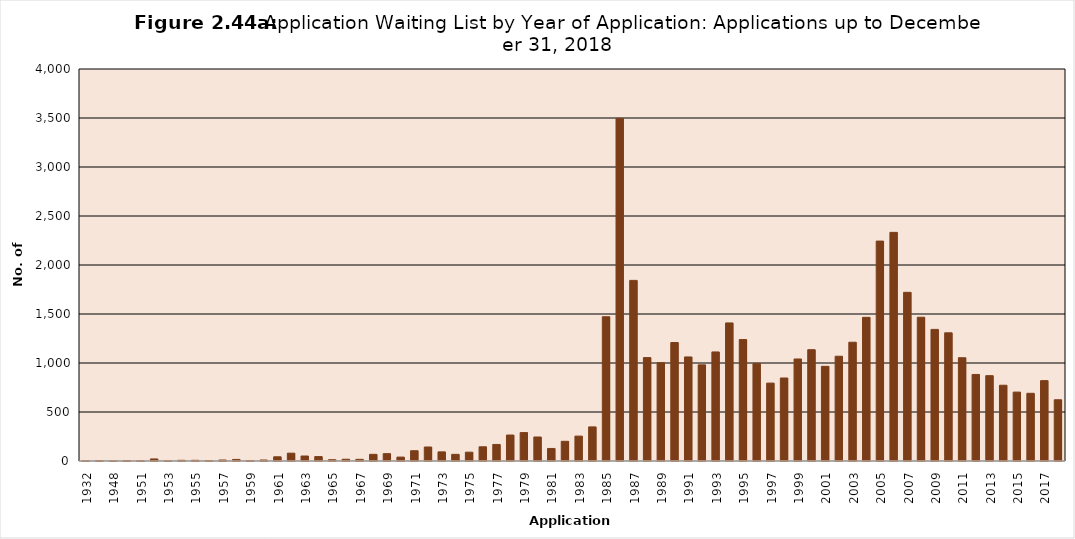
| Category | Series 0 |
|---|---|
| 1932.0 | 1 |
| 1947.0 | 4 |
| 1948.0 | 1 |
| 1950.0 | 4 |
| 1951.0 | 3 |
| 1952.0 | 21 |
| 1953.0 | 2 |
| 1954.0 | 7 |
| 1955.0 | 7 |
| 1956.0 | 5 |
| 1957.0 | 10 |
| 1958.0 | 16 |
| 1959.0 | 5 |
| 1960.0 | 10 |
| 1961.0 | 43 |
| 1962.0 | 80 |
| 1963.0 | 51 |
| 1964.0 | 45 |
| 1965.0 | 13 |
| 1966.0 | 18 |
| 1967.0 | 17 |
| 1968.0 | 68 |
| 1969.0 | 75 |
| 1970.0 | 40 |
| 1971.0 | 105 |
| 1972.0 | 143 |
| 1973.0 | 93 |
| 1974.0 | 68 |
| 1975.0 | 90 |
| 1976.0 | 145 |
| 1977.0 | 169 |
| 1978.0 | 265 |
| 1979.0 | 290 |
| 1980.0 | 245 |
| 1981.0 | 128 |
| 1982.0 | 201 |
| 1983.0 | 254 |
| 1984.0 | 348 |
| 1985.0 | 1472 |
| 1986.0 | 3496 |
| 1987.0 | 1843 |
| 1988.0 | 1055 |
| 1989.0 | 1004 |
| 1990.0 | 1209 |
| 1991.0 | 1062 |
| 1992.0 | 981 |
| 1993.0 | 1113 |
| 1994.0 | 1409 |
| 1995.0 | 1239 |
| 1996.0 | 996 |
| 1997.0 | 795 |
| 1998.0 | 847 |
| 1999.0 | 1041 |
| 2000.0 | 1136 |
| 2001.0 | 966 |
| 2002.0 | 1069 |
| 2003.0 | 1212 |
| 2004.0 | 1466 |
| 2005.0 | 2244 |
| 2006.0 | 2333 |
| 2007.0 | 1721 |
| 2008.0 | 1467 |
| 2009.0 | 1343 |
| 2010.0 | 1308 |
| 2011.0 | 1054 |
| 2012.0 | 883 |
| 2013.0 | 871 |
| 2014.0 | 773 |
| 2015.0 | 703 |
| 2016.0 | 691 |
| 2017.0 | 820 |
| 2018.0 | 625 |